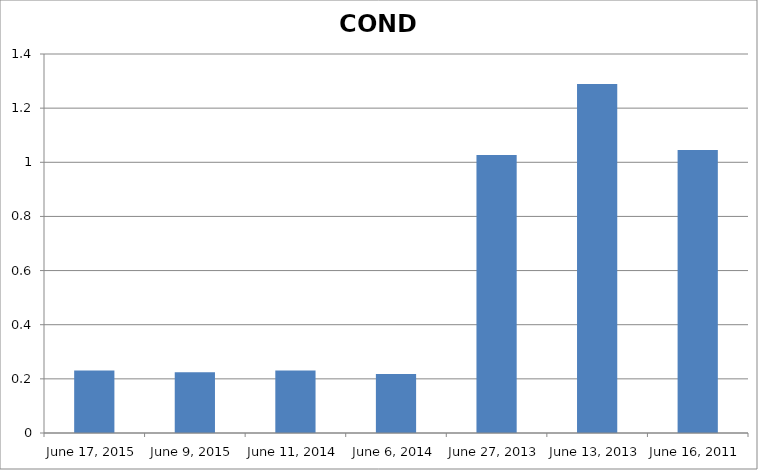
| Category | COND |
|---|---|
| 2015-06-17 | 0.231 |
| 2015-06-09 | 0.224 |
| 2014-06-11 | 0.231 |
| 2014-06-06 | 0.218 |
| 2013-06-27 | 1.027 |
| 2013-06-13 | 1.289 |
| 2011-06-16 | 1.045 |